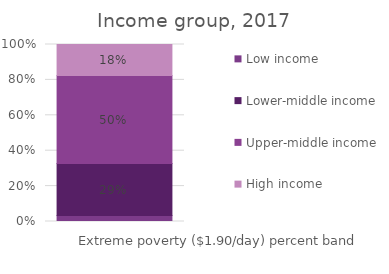
| Category | Low income | Lower-middle income | Upper-middle income | High income |
|---|---|---|---|---|
| 0 | 0.034 | 0.294 | 0.497 | 0.175 |